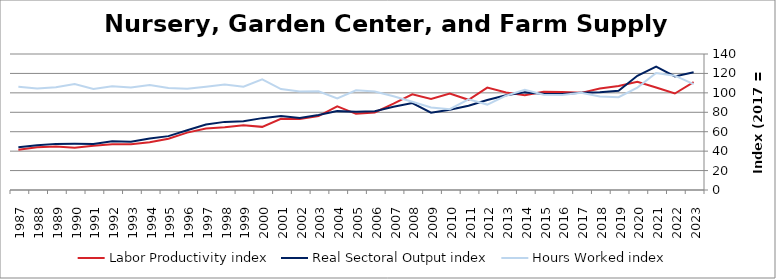
| Category | Labor Productivity index | Real Sectoral Output index | Hours Worked index |
|---|---|---|---|
| 2023.0 | 111.146 | 121.147 | 108.998 |
| 2022.0 | 99.328 | 116.918 | 117.708 |
| 2021.0 | 105.478 | 126.995 | 120.399 |
| 2020.0 | 111.508 | 117.523 | 105.394 |
| 2019.0 | 107.031 | 102.191 | 95.478 |
| 2018.0 | 104.576 | 100.656 | 96.252 |
| 2017.0 | 100 | 100 | 100 |
| 2016.0 | 100.993 | 98.719 | 97.748 |
| 2015.0 | 101.094 | 99.044 | 97.972 |
| 2014.0 | 97.437 | 100.491 | 103.134 |
| 2013.0 | 100.371 | 97.46 | 97.1 |
| 2012.0 | 105.362 | 92.647 | 87.932 |
| 2011.0 | 92.861 | 86.72 | 93.388 |
| 2010.0 | 99.325 | 82.58 | 83.141 |
| 2009.0 | 93.643 | 79.53 | 84.929 |
| 2008.0 | 98.503 | 89.439 | 90.799 |
| 2007.0 | 88.817 | 85.682 | 96.471 |
| 2006.0 | 79.822 | 80.999 | 101.475 |
| 2005.0 | 78.397 | 80.456 | 102.627 |
| 2004.0 | 86.055 | 81.193 | 94.35 |
| 2003.0 | 76.016 | 77.266 | 101.645 |
| 2002.0 | 73.075 | 74.148 | 101.468 |
| 2001.0 | 73.271 | 76.129 | 103.9 |
| 2000.0 | 64.986 | 73.978 | 113.836 |
| 1999.0 | 66.587 | 70.78 | 106.296 |
| 1998.0 | 64.63 | 70.128 | 108.506 |
| 1997.0 | 63.387 | 67.391 | 106.317 |
| 1996.0 | 59.078 | 61.57 | 104.218 |
| 1995.0 | 52.853 | 55.448 | 104.91 |
| 1994.0 | 49.073 | 53.002 | 108.008 |
| 1993.0 | 47.021 | 49.584 | 105.45 |
| 1992.0 | 47.001 | 50.163 | 106.728 |
| 1991.0 | 45.552 | 47.397 | 104.05 |
| 1990.0 | 43.62 | 47.537 | 108.979 |
| 1989.0 | 44.899 | 47.481 | 105.75 |
| 1988.0 | 44.02 | 46.024 | 104.554 |
| 1987.0 | 41.487 | 44.13 | 106.371 |